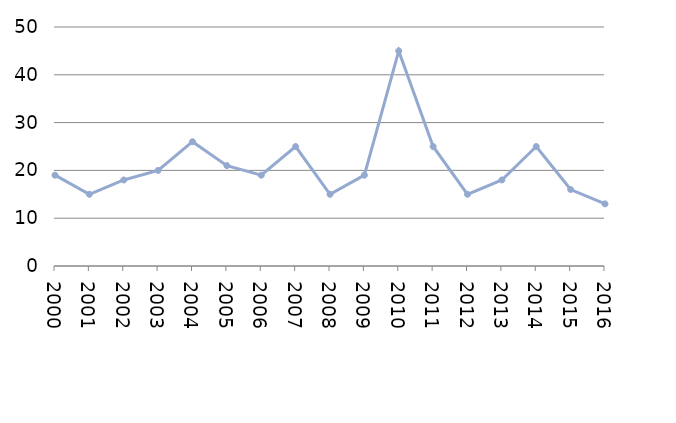
| Category | Avlidna |
|---|---|
| 2000 | 19 |
| 2001 | 15 |
| 2002 | 18 |
| 2003 | 20 |
| 2004 | 26 |
| 2005 | 21 |
| 2006 | 19 |
| 2007 | 25 |
| 2008 | 15 |
| 2009 | 19 |
| 2010 | 45 |
| 2011 | 25 |
| 2012 | 15 |
| 2013 | 18 |
| 2014 | 25 |
| 2015 | 16 |
| 2016 | 13 |